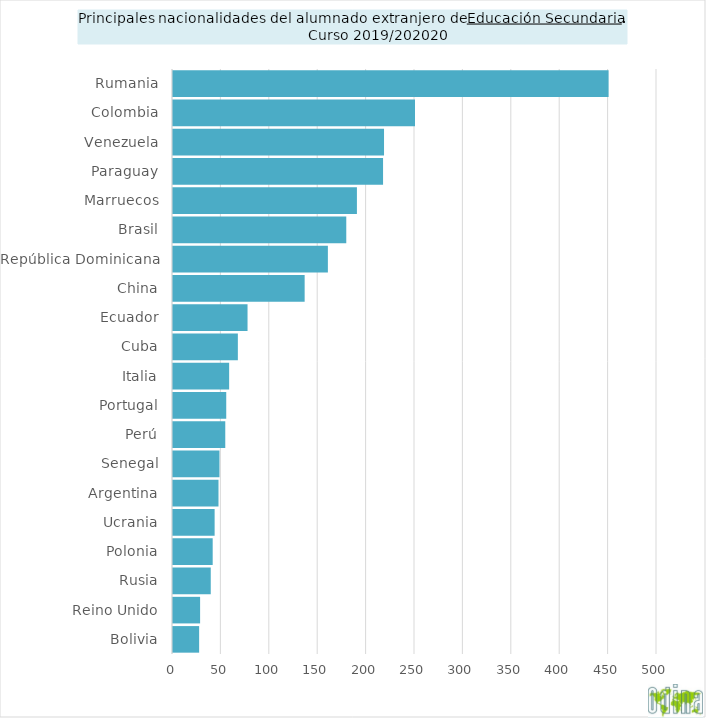
| Category | TOTAL |
|---|---|
| Bolivia | 27 |
| Reino Unido | 28 |
| Rusia | 39 |
| Polonia | 41 |
| Ucrania | 43 |
| Argentina | 47 |
| Senegal | 48 |
| Perú | 54 |
| Portugal | 55 |
| Italia | 58 |
| Cuba | 67 |
| Ecuador | 77 |
| China | 136 |
| República Dominicana | 160 |
| Brasil | 179 |
| Marruecos | 190 |
| Paraguay | 217 |
| Venezuela | 218 |
| Colombia | 250 |
| Rumania | 450 |